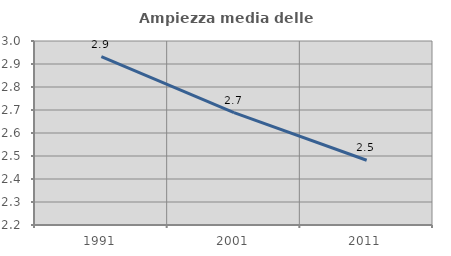
| Category | Ampiezza media delle famiglie |
|---|---|
| 1991.0 | 2.932 |
| 2001.0 | 2.689 |
| 2011.0 | 2.482 |